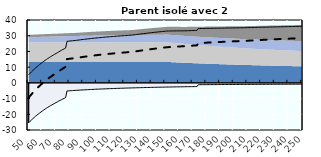
| Category | Coin fiscal moyen (somme des composantes) | Taux moyen d'imposition net en % du salaire brut |
|---|---|---|
| 50.0 | 5.152 | -9.417 |
| 51.0 | 6.08 | -8.346 |
| 52.0 | 6.973 | -7.316 |
| 53.0 | 7.832 | -6.326 |
| 54.0 | 8.659 | -5.372 |
| 55.0 | 9.455 | -4.452 |
| 56.0 | 10.224 | -3.566 |
| 57.0 | 10.965 | -2.71 |
| 58.0 | 11.681 | -1.884 |
| 59.0 | 12.373 | -1.086 |
| 60.0 | 13.042 | -0.315 |
| 61.0 | 13.688 | 0.431 |
| 62.0 | 14.314 | 1.153 |
| 63.0 | 14.92 | 1.852 |
| 64.0 | 15.507 | 2.529 |
| 65.0 | 16.076 | 3.185 |
| 66.0 | 16.628 | 3.822 |
| 67.0 | 17.163 | 4.439 |
| 68.0 | 17.683 | 5.039 |
| 69.0 | 18.187 | 5.621 |
| 70.0 | 18.686 | 6.196 |
| 71.0 | 19.219 | 6.811 |
| 72.0 | 19.738 | 7.41 |
| 73.0 | 20.243 | 7.992 |
| 74.0 | 20.733 | 8.558 |
| 75.0 | 21.211 | 9.109 |
| 76.0 | 21.676 | 9.646 |
| 77.0 | 22.13 | 10.169 |
| 78.0 | 26.414 | 15.111 |
| 79.0 | 26.515 | 15.228 |
| 80.0 | 26.614 | 15.342 |
| 81.0 | 26.711 | 15.453 |
| 82.0 | 26.805 | 15.562 |
| 83.0 | 26.897 | 15.668 |
| 84.0 | 26.986 | 15.771 |
| 85.0 | 27.075 | 15.874 |
| 86.0 | 27.194 | 16.012 |
| 87.0 | 27.311 | 16.146 |
| 88.0 | 27.425 | 16.277 |
| 89.0 | 27.536 | 16.405 |
| 90.0 | 27.645 | 16.531 |
| 91.0 | 27.751 | 16.654 |
| 92.0 | 27.855 | 16.774 |
| 93.0 | 27.957 | 16.891 |
| 94.0 | 28.057 | 17.006 |
| 95.0 | 28.154 | 17.119 |
| 96.0 | 28.25 | 17.229 |
| 97.0 | 28.343 | 17.337 |
| 98.0 | 28.435 | 17.443 |
| 99.0 | 28.525 | 17.546 |
| 100.0 | 28.613 | 17.648 |
| 101.0 | 28.699 | 17.747 |
| 102.0 | 28.784 | 17.845 |
| 103.0 | 28.866 | 17.94 |
| 104.0 | 28.948 | 18.034 |
| 105.0 | 29.028 | 18.126 |
| 106.0 | 29.106 | 18.216 |
| 107.0 | 29.183 | 18.305 |
| 108.0 | 29.258 | 18.392 |
| 109.0 | 29.332 | 18.477 |
| 110.0 | 29.405 | 18.561 |
| 111.0 | 29.476 | 18.644 |
| 112.0 | 29.546 | 18.724 |
| 113.0 | 29.615 | 18.804 |
| 114.0 | 29.683 | 18.882 |
| 115.0 | 29.749 | 18.958 |
| 116.0 | 29.814 | 19.034 |
| 117.0 | 29.879 | 19.108 |
| 118.0 | 29.942 | 19.181 |
| 119.0 | 30.004 | 19.252 |
| 120.0 | 30.065 | 19.323 |
| 121.0 | 30.125 | 19.392 |
| 122.0 | 30.184 | 19.46 |
| 123.0 | 30.242 | 19.527 |
| 124.0 | 30.299 | 19.593 |
| 125.0 | 30.359 | 19.662 |
| 126.0 | 30.461 | 19.779 |
| 127.0 | 30.56 | 19.894 |
| 128.0 | 30.659 | 20.008 |
| 129.0 | 30.774 | 20.141 |
| 130.0 | 30.89 | 20.274 |
| 131.0 | 31.003 | 20.405 |
| 132.0 | 31.115 | 20.534 |
| 133.0 | 31.225 | 20.661 |
| 134.0 | 31.334 | 20.787 |
| 135.0 | 31.441 | 20.91 |
| 136.0 | 31.546 | 21.031 |
| 137.0 | 31.65 | 21.151 |
| 138.0 | 31.752 | 21.269 |
| 139.0 | 31.853 | 21.385 |
| 140.0 | 31.952 | 21.5 |
| 141.0 | 32.05 | 21.613 |
| 142.0 | 32.147 | 21.724 |
| 143.0 | 32.242 | 21.834 |
| 144.0 | 32.336 | 21.943 |
| 145.0 | 32.428 | 22.049 |
| 146.0 | 32.52 | 22.155 |
| 147.0 | 32.61 | 22.259 |
| 148.0 | 32.699 | 22.361 |
| 149.0 | 32.786 | 22.462 |
| 150.0 | 32.873 | 22.562 |
| 151.0 | 32.958 | 22.661 |
| 152.0 | 32.995 | 22.73 |
| 153.0 | 33.008 | 22.785 |
| 154.0 | 33.02 | 22.838 |
| 155.0 | 33.033 | 22.891 |
| 156.0 | 33.045 | 22.944 |
| 157.0 | 33.057 | 22.996 |
| 158.0 | 33.069 | 23.047 |
| 159.0 | 33.081 | 23.097 |
| 160.0 | 33.092 | 23.147 |
| 161.0 | 33.104 | 23.196 |
| 162.0 | 33.115 | 23.245 |
| 163.0 | 33.127 | 23.293 |
| 164.0 | 33.138 | 23.34 |
| 165.0 | 33.15 | 23.388 |
| 166.0 | 33.177 | 23.453 |
| 167.0 | 33.203 | 23.517 |
| 168.0 | 33.23 | 23.58 |
| 169.0 | 33.256 | 23.642 |
| 170.0 | 33.281 | 23.704 |
| 171.0 | 33.307 | 23.764 |
| 172.0 | 33.332 | 23.825 |
| 173.0 | 33.357 | 23.884 |
| 174.0 | 34.554 | 25.281 |
| 175.0 | 34.572 | 25.331 |
| 176.0 | 34.59 | 25.381 |
| 177.0 | 34.607 | 25.43 |
| 178.0 | 34.625 | 25.479 |
| 179.0 | 34.642 | 25.527 |
| 180.0 | 34.659 | 25.575 |
| 181.0 | 34.676 | 25.622 |
| 182.0 | 34.693 | 25.669 |
| 183.0 | 34.71 | 25.715 |
| 184.0 | 34.726 | 25.761 |
| 185.0 | 34.743 | 25.806 |
| 186.0 | 34.759 | 25.85 |
| 187.0 | 34.775 | 25.895 |
| 188.0 | 34.791 | 25.938 |
| 189.0 | 34.806 | 25.981 |
| 190.0 | 34.822 | 26.024 |
| 191.0 | 34.837 | 26.067 |
| 192.0 | 34.853 | 26.108 |
| 193.0 | 34.868 | 26.15 |
| 194.0 | 34.883 | 26.191 |
| 195.0 | 34.897 | 26.231 |
| 196.0 | 34.912 | 26.272 |
| 197.0 | 34.927 | 26.311 |
| 198.0 | 34.941 | 26.351 |
| 199.0 | 34.955 | 26.39 |
| 200.0 | 34.969 | 26.428 |
| 201.0 | 34.983 | 26.467 |
| 202.0 | 34.997 | 26.504 |
| 203.0 | 35.011 | 26.542 |
| 204.0 | 35.024 | 26.579 |
| 205.0 | 35.038 | 26.616 |
| 206.0 | 35.051 | 26.652 |
| 207.0 | 35.067 | 26.691 |
| 208.0 | 35.092 | 26.74 |
| 209.0 | 35.118 | 26.79 |
| 210.0 | 35.143 | 26.838 |
| 211.0 | 35.167 | 26.886 |
| 212.0 | 35.192 | 26.934 |
| 213.0 | 35.216 | 26.981 |
| 214.0 | 35.24 | 27.028 |
| 215.0 | 35.264 | 27.075 |
| 216.0 | 35.288 | 27.121 |
| 217.0 | 35.311 | 27.166 |
| 218.0 | 35.335 | 27.211 |
| 219.0 | 35.358 | 27.256 |
| 220.0 | 35.381 | 27.301 |
| 221.0 | 35.403 | 27.344 |
| 222.0 | 35.426 | 27.388 |
| 223.0 | 35.448 | 27.431 |
| 224.0 | 35.47 | 27.474 |
| 225.0 | 35.492 | 27.516 |
| 226.0 | 35.514 | 27.558 |
| 227.0 | 35.536 | 27.6 |
| 228.0 | 35.557 | 27.641 |
| 229.0 | 35.578 | 27.682 |
| 230.0 | 35.599 | 27.723 |
| 231.0 | 35.62 | 27.763 |
| 232.0 | 35.641 | 27.803 |
| 233.0 | 35.661 | 27.842 |
| 234.0 | 35.682 | 27.881 |
| 235.0 | 35.702 | 27.92 |
| 236.0 | 35.722 | 27.959 |
| 237.0 | 35.742 | 27.997 |
| 238.0 | 35.761 | 28.035 |
| 239.0 | 35.781 | 28.072 |
| 240.0 | 35.8 | 28.109 |
| 241.0 | 35.82 | 28.146 |
| 242.0 | 35.839 | 28.183 |
| 243.0 | 35.858 | 28.219 |
| 244.0 | 35.877 | 28.255 |
| 245.0 | 35.895 | 28.291 |
| 246.0 | 35.914 | 28.327 |
| 247.0 | 35.932 | 28.362 |
| 248.0 | 35.95 | 28.397 |
| 249.0 | 35.975 | 28.439 |
| 250.0 | 36.028 | 28.512 |